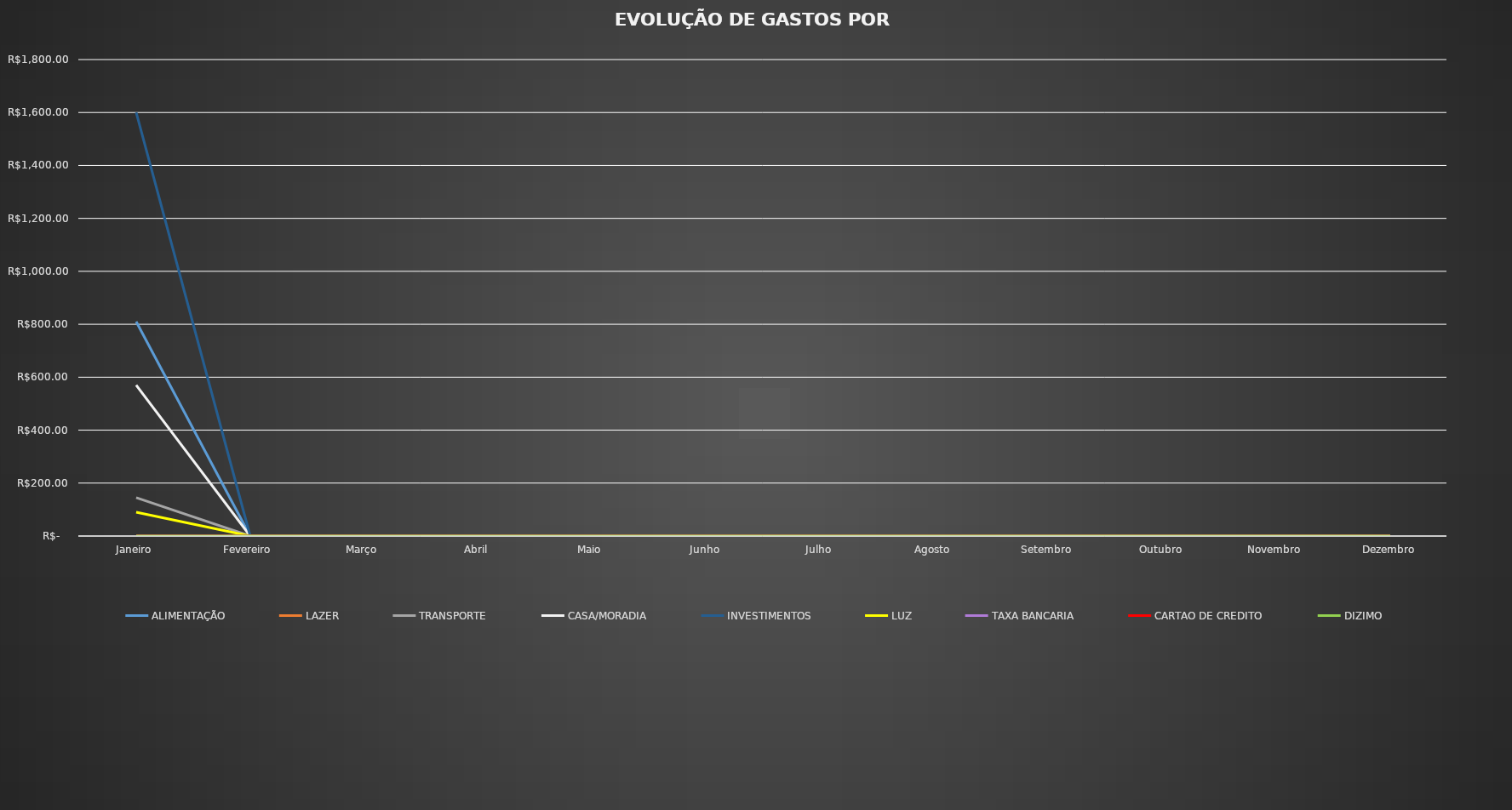
| Category | ALIMENTAÇÃO | LAZER | TRANSPORTE | CASA/MORADIA | INVESTIMENTOS | LUZ | TAXA BANCARIA | CARTAO DE CREDITO | DIZIMO |
|---|---|---|---|---|---|---|---|---|---|
| Janeiro | 810 | 0 | 145 | 570 | 1600 | 90 | 0 | 0 | 0 |
| Fevereiro | 0 | 0 | 0 | 0 | 0 | 0 | 0 | 0 | 0 |
| Março | 0 | 0 | 0 | 0 | 0 | 0 | 0 | 0 | 0 |
| Abril | 0 | 0 | 0 | 0 | 0 | 0 | 0 | 0 | 0 |
| Maio | 0 | 0 | 0 | 0 | 0 | 0 | 0 | 0 | 0 |
| Junho | 0 | 0 | 0 | 0 | 0 | 0 | 0 | 0 | 0 |
| Julho | 0 | 0 | 0 | 0 | 0 | 0 | 0 | 0 | 0 |
| Agosto | 0 | 0 | 0 | 0 | 0 | 0 | 0 | 0 | 0 |
| Setembro | 0 | 0 | 0 | 0 | 0 | 0 | 0 | 0 | 0 |
| Outubro | 0 | 0 | 0 | 0 | 0 | 0 | 0 | 0 | 0 |
| Novembro | 0 | 0 | 0 | 0 | 0 | 0 | 0 | 0 | 0 |
| Dezembro | 0 | 0 | 0 | 0 | 0 | 0 | 0 | 0 | 0 |